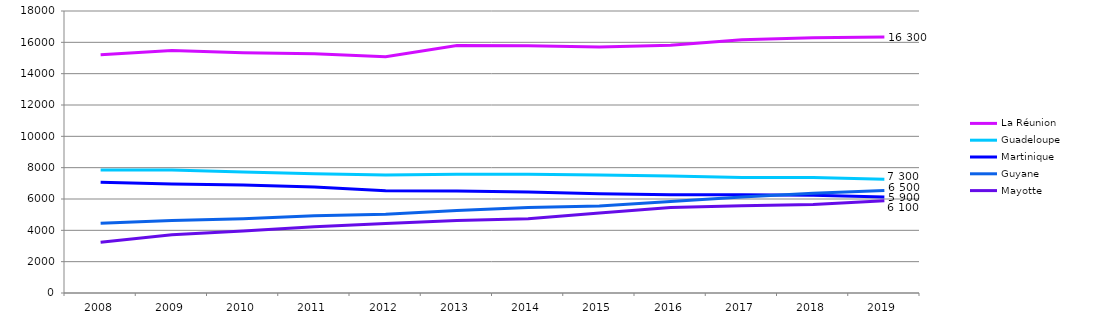
| Category | La Réunion | Guadeloupe | Martinique | Guyane | Mayotte |
|---|---|---|---|---|---|
| 2008.0 | 15205 | 7851 | 7063 | 4452 | 3232 |
| 2009.0 | 15482 | 7858 | 6958 | 4620 | 3714 |
| 2010.0 | 15340 | 7728 | 6900 | 4738 | 3955 |
| 2011.0 | 15266 | 7614 | 6772 | 4931 | 4225 |
| 2012.0 | 15084 | 7537 | 6531 | 5029 | 4434 |
| 2013.0 | 15795 | 7583 | 6507 | 5264 | 4621 |
| 2014.0 | 15788 | 7585 | 6443 | 5458 | 4734 |
| 2015.0 | 15710 | 7533 | 6341 | 5561 | 5113 |
| 2016.0 | 15809 | 7474 | 6277 | 5835 | 5461 |
| 2017.0 | 16172 | 7366 | 6274 | 6130 | 5576 |
| 2018.0 | 16286 | 7370 | 6233 | 6367 | 5644 |
| 2019.0 | 16333 | 7262 | 6128 | 6540 | 5885 |